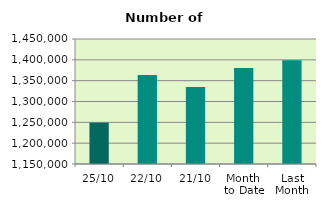
| Category | Series 0 |
|---|---|
| 25/10 | 1249246 |
| 22/10 | 1363574 |
| 21/10 | 1335030 |
| Month 
to Date | 1380331.529 |
| Last
Month | 1399299.909 |